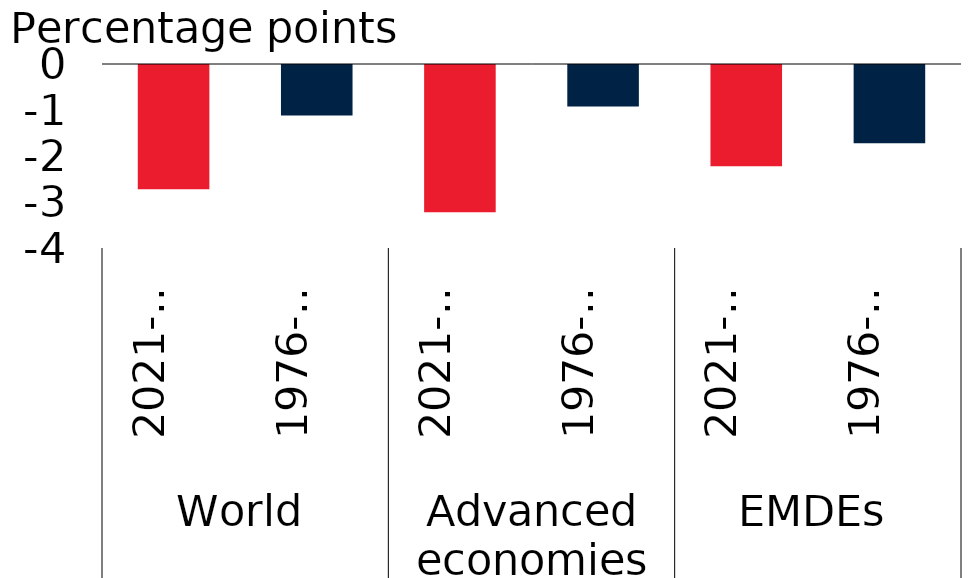
| Category | Three-year slowdown |
|---|---|
| 0 | -2.7 |
| 1 | -1.1 |
| 2 | -3.2 |
| 3 | -0.9 |
| 4 | -2.2 |
| 5 | -1.7 |